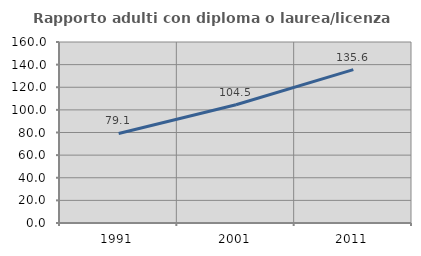
| Category | Rapporto adulti con diploma o laurea/licenza media  |
|---|---|
| 1991.0 | 79.141 |
| 2001.0 | 104.505 |
| 2011.0 | 135.622 |